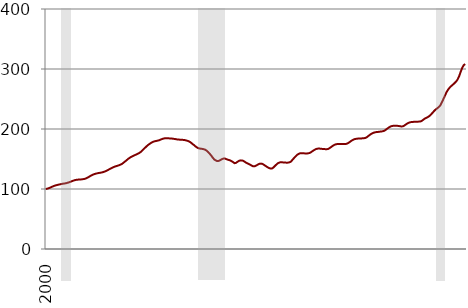
| Category | Series 0 |
|---|---|
| 2000-01-01 | 100 |
| 2000-02-01 | 100.571 |
| 2000-03-01 | 101.466 |
| 2000-04-01 | 102.54 |
| 2000-05-01 | 103.701 |
| 2000-06-01 | 104.855 |
| 2000-07-01 | 105.721 |
| 2000-08-01 | 106.521 |
| 2000-09-01 | 107.135 |
| 2000-10-01 | 107.728 |
| 2000-11-01 | 108.291 |
| 2000-12-01 | 108.791 |
| 2001-01-01 | 109.214 |
| 2001-02-01 | 109.641 |
| 2001-03-01 | 110.393 |
| 2001-04-01 | 111.247 |
| 2001-05-01 | 112.202 |
| 2001-06-01 | 113.272 |
| 2001-07-01 | 114.226 |
| 2001-08-01 | 114.987 |
| 2001-09-01 | 115.464 |
| 2001-10-01 | 115.68 |
| 2001-11-01 | 115.837 |
| 2001-12-01 | 116.054 |
| 2002-01-01 | 116.436 |
| 2002-02-01 | 116.916 |
| 2002-03-01 | 117.929 |
| 2002-04-01 | 119.209 |
| 2002-05-01 | 120.788 |
| 2002-06-01 | 122.333 |
| 2002-07-01 | 123.687 |
| 2002-08-01 | 124.73 |
| 2002-09-01 | 125.494 |
| 2002-10-01 | 126.136 |
| 2002-11-01 | 126.642 |
| 2002-12-01 | 127.15 |
| 2003-01-01 | 127.652 |
| 2003-02-01 | 128.326 |
| 2003-03-01 | 129.308 |
| 2003-04-01 | 130.488 |
| 2003-05-01 | 131.839 |
| 2003-06-01 | 133.225 |
| 2003-07-01 | 134.646 |
| 2003-08-01 | 135.965 |
| 2003-09-01 | 137.076 |
| 2003-10-01 | 137.976 |
| 2003-11-01 | 138.765 |
| 2003-12-01 | 139.628 |
| 2004-01-01 | 140.705 |
| 2004-02-01 | 142.029 |
| 2004-03-01 | 144.08 |
| 2004-04-01 | 146.179 |
| 2004-05-01 | 148.334 |
| 2004-06-01 | 150.518 |
| 2004-07-01 | 152.337 |
| 2004-08-01 | 153.814 |
| 2004-09-01 | 155.108 |
| 2004-10-01 | 156.299 |
| 2004-11-01 | 157.496 |
| 2004-12-01 | 158.67 |
| 2005-01-01 | 160.13 |
| 2005-02-01 | 161.924 |
| 2005-03-01 | 164.576 |
| 2005-04-01 | 166.999 |
| 2005-05-01 | 169.544 |
| 2005-06-01 | 172.015 |
| 2005-07-01 | 174.097 |
| 2005-08-01 | 175.922 |
| 2005-09-01 | 177.61 |
| 2005-10-01 | 178.752 |
| 2005-11-01 | 179.674 |
| 2005-12-01 | 180.107 |
| 2006-01-01 | 180.828 |
| 2006-02-01 | 181.5 |
| 2006-03-01 | 182.749 |
| 2006-04-01 | 183.648 |
| 2006-05-01 | 184.38 |
| 2006-06-01 | 184.547 |
| 2006-07-01 | 184.607 |
| 2006-08-01 | 184.404 |
| 2006-09-01 | 184.198 |
| 2006-10-01 | 184.055 |
| 2006-11-01 | 183.633 |
| 2006-12-01 | 183.231 |
| 2007-01-01 | 182.72 |
| 2007-02-01 | 182.472 |
| 2007-03-01 | 182.194 |
| 2007-04-01 | 182.132 |
| 2007-05-01 | 181.885 |
| 2007-06-01 | 181.54 |
| 2007-07-01 | 180.993 |
| 2007-08-01 | 180.235 |
| 2007-09-01 | 179.122 |
| 2007-10-01 | 177.53 |
| 2007-11-01 | 175.162 |
| 2007-12-01 | 173.338 |
| 2008-01-01 | 171.079 |
| 2008-02-01 | 169.193 |
| 2008-03-01 | 167.905 |
| 2008-04-01 | 167.323 |
| 2008-05-01 | 167.02 |
| 2008-06-01 | 166.537 |
| 2008-07-01 | 165.714 |
| 2008-08-01 | 164.279 |
| 2008-09-01 | 161.913 |
| 2008-10-01 | 159.164 |
| 2008-11-01 | 156.072 |
| 2008-12-01 | 152.544 |
| 2009-01-01 | 149.361 |
| 2009-02-01 | 147.616 |
| 2009-03-01 | 146.514 |
| 2009-04-01 | 146.943 |
| 2009-05-01 | 148.171 |
| 2009-06-01 | 149.797 |
| 2009-07-01 | 150.748 |
| 2009-08-01 | 150.667 |
| 2009-09-01 | 149.625 |
| 2009-10-01 | 148.582 |
| 2009-11-01 | 147.937 |
| 2009-12-01 | 146.664 |
| 2010-01-01 | 145.003 |
| 2010-02-01 | 143.055 |
| 2010-03-01 | 143.597 |
| 2010-04-01 | 145.402 |
| 2010-05-01 | 147.037 |
| 2010-06-01 | 147.702 |
| 2010-07-01 | 147.563 |
| 2010-08-01 | 146.428 |
| 2010-09-01 | 144.608 |
| 2010-10-01 | 143.127 |
| 2010-11-01 | 141.819 |
| 2010-12-01 | 140.633 |
| 2011-01-01 | 139.045 |
| 2011-02-01 | 137.742 |
| 2011-03-01 | 137.793 |
| 2011-04-01 | 139.161 |
| 2011-05-01 | 140.693 |
| 2011-06-01 | 141.945 |
| 2011-07-01 | 142.341 |
| 2011-08-01 | 141.785 |
| 2011-09-01 | 140.169 |
| 2011-10-01 | 138.412 |
| 2011-11-01 | 136.668 |
| 2011-12-01 | 135.169 |
| 2012-01-01 | 134.167 |
| 2012-02-01 | 133.993 |
| 2012-03-01 | 135.862 |
| 2012-04-01 | 138.472 |
| 2012-05-01 | 141.051 |
| 2012-06-01 | 143.171 |
| 2012-07-01 | 144.283 |
| 2012-08-01 | 144.705 |
| 2012-09-01 | 144.357 |
| 2012-10-01 | 143.967 |
| 2012-11-01 | 143.96 |
| 2012-12-01 | 143.867 |
| 2013-01-01 | 144.312 |
| 2013-02-01 | 145.163 |
| 2013-03-01 | 147.962 |
| 2013-04-01 | 150.97 |
| 2013-05-01 | 153.863 |
| 2013-06-01 | 156.433 |
| 2013-07-01 | 158.296 |
| 2013-08-01 | 159.404 |
| 2013-09-01 | 159.682 |
| 2013-10-01 | 159.562 |
| 2013-11-01 | 159.366 |
| 2013-12-01 | 159.284 |
| 2014-01-01 | 159.374 |
| 2014-02-01 | 159.878 |
| 2014-03-01 | 161.194 |
| 2014-04-01 | 162.972 |
| 2014-05-01 | 164.686 |
| 2014-06-01 | 166.215 |
| 2014-07-01 | 167.14 |
| 2014-08-01 | 167.455 |
| 2014-09-01 | 167.246 |
| 2014-10-01 | 166.915 |
| 2014-11-01 | 166.663 |
| 2014-12-01 | 166.467 |
| 2015-01-01 | 166.258 |
| 2015-02-01 | 166.642 |
| 2015-03-01 | 168.098 |
| 2015-04-01 | 169.977 |
| 2015-05-01 | 171.856 |
| 2015-06-01 | 173.457 |
| 2015-07-01 | 174.502 |
| 2015-08-01 | 174.946 |
| 2015-09-01 | 175.055 |
| 2015-10-01 | 175.062 |
| 2015-11-01 | 175.157 |
| 2015-12-01 | 175.133 |
| 2016-01-01 | 175.055 |
| 2016-02-01 | 175.301 |
| 2016-03-01 | 176.619 |
| 2016-04-01 | 178.509 |
| 2016-05-01 | 180.354 |
| 2016-06-01 | 181.926 |
| 2016-07-01 | 183.03 |
| 2016-08-01 | 183.668 |
| 2016-09-01 | 183.958 |
| 2016-10-01 | 184.033 |
| 2016-11-01 | 184.246 |
| 2016-12-01 | 184.419 |
| 2017-01-01 | 184.672 |
| 2017-02-01 | 185.04 |
| 2017-03-01 | 186.546 |
| 2017-04-01 | 188.556 |
| 2017-05-01 | 190.554 |
| 2017-06-01 | 192.288 |
| 2017-07-01 | 193.539 |
| 2017-08-01 | 194.375 |
| 2017-09-01 | 194.844 |
| 2017-10-01 | 195.107 |
| 2017-11-01 | 195.47 |
| 2017-12-01 | 195.864 |
| 2018-01-01 | 196.134 |
| 2018-02-01 | 196.924 |
| 2018-03-01 | 198.593 |
| 2018-04-01 | 200.636 |
| 2018-05-01 | 202.474 |
| 2018-06-01 | 204.066 |
| 2018-07-01 | 204.974 |
| 2018-08-01 | 205.352 |
| 2018-09-01 | 205.397 |
| 2018-10-01 | 205.391 |
| 2018-11-01 | 205.129 |
| 2018-12-01 | 204.722 |
| 2019-01-01 | 204.233 |
| 2019-02-01 | 204.467 |
| 2019-03-01 | 205.816 |
| 2019-04-01 | 207.729 |
| 2019-05-01 | 209.393 |
| 2019-06-01 | 210.629 |
| 2019-07-01 | 211.381 |
| 2019-08-01 | 211.74 |
| 2019-09-01 | 211.92 |
| 2019-10-01 | 212.014 |
| 2019-11-01 | 212.154 |
| 2019-12-01 | 212.283 |
| 2020-01-01 | 212.435 |
| 2020-02-01 | 213.25 |
| 2020-03-01 | 215.225 |
| 2020-04-01 | 217.272 |
| 2020-05-01 | 218.523 |
| 2020-06-01 | 219.852 |
| 2020-07-01 | 221.61 |
| 2020-08-01 | 224.092 |
| 2020-09-01 | 226.848 |
| 2020-10-01 | 229.863 |
| 2020-11-01 | 232.374 |
| 2020-12-01 | 234.429 |
| 2021-01-01 | 236.515 |
| 2021-02-01 | 239.292 |
| 2021-03-01 | 244.297 |
| 2021-04-01 | 249.901 |
| 2021-05-01 | 255.529 |
| 2021-06-01 | 261.256 |
| 2021-07-01 | 265.59 |
| 2021-08-01 | 268.859 |
| 2021-09-01 | 271.508 |
| 2021-10-01 | 273.715 |
| 2021-11-01 | 276.089 |
| 2021-12-01 | 278.667 |
| 2022-01-01 | 282.032 |
| 2022-02-01 | 287.276 |
| 2022-03-01 | 294.71 |
| 2022-04-01 | 301.486 |
| 2022-05-01 | 306.375 |
| 2022-06-01 | 308.183 |